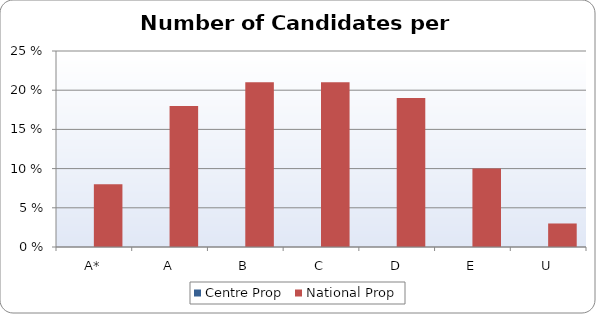
| Category | Centre Prop | National Prop |
|---|---|---|
| A* | 0 | 8 |
| A | 0 | 18 |
| B | 0 | 21 |
| C | 0 | 21 |
| D | 0 | 19 |
| E | 0 | 10 |
| U | 0 | 3 |